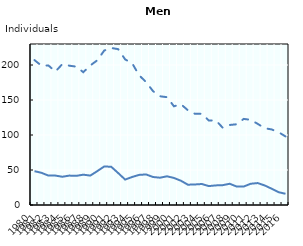
| Category | 15 - 19 | 20-29 |
|---|---|---|
| 1980.0 | 48.333 | 207 |
| 1981.0 | 46 | 199 |
| 1982.0 | 42 | 199.333 |
| 1983.0 | 42 | 190.667 |
| 1984.0 | 40.333 | 201.333 |
| 1985.0 | 42 | 199 |
| 1986.0 | 41.667 | 197.667 |
| 1987.0 | 43.333 | 189.667 |
| 1988.0 | 42 | 199.333 |
| 1989.0 | 48.333 | 206.667 |
| 1990.0 | 55 | 220.667 |
| 1991.0 | 54.667 | 224.333 |
| 1992.0 | 45.667 | 222.667 |
| 1993.0 | 36.333 | 208 |
| 1994.0 | 40 | 202.667 |
| 1995.0 | 43 | 185.333 |
| 1996.0 | 43.667 | 175.667 |
| 1997.0 | 40 | 162.667 |
| 1998.0 | 39 | 155.333 |
| 1999.0 | 41 | 154 |
| 2000.0 | 38.667 | 141 |
| 2001.0 | 34.667 | 144 |
| 2002.0 | 29 | 135.333 |
| 2003.0 | 29.333 | 130.333 |
| 2004.0 | 30 | 130.333 |
| 2005.0 | 27 | 120.667 |
| 2006.0 | 28 | 121 |
| 2007.0 | 28.333 | 110.333 |
| 2008.0 | 30.333 | 114.333 |
| 2009.0 | 26.333 | 115.333 |
| 2010.0 | 26.333 | 123 |
| 2011.0 | 30.333 | 121.667 |
| 2012.0 | 31.333 | 116 |
| 2013.0 | 28 | 109.667 |
| 2014.0 | 23.333 | 108 |
| 2015.0 | 18.333 | 104 |
| 2016.0 | 16 | 98 |